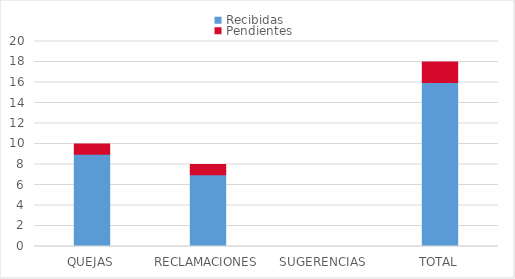
| Category | Recibidas  | Pendientes  |
|---|---|---|
| QUEJAS | 9 | 1 |
| RECLAMACIONES | 7 | 1 |
| SUGERENCIAS | 0 | 0 |
| TOTAL | 16 | 2 |